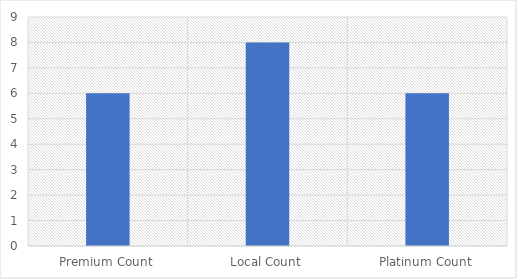
| Category | Series 0 |
|---|---|
| Premium Count | 6 |
| Local Count | 8 |
| Platinum Count | 6 |